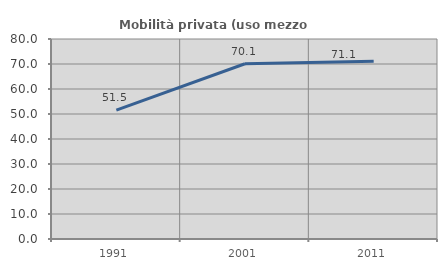
| Category | Mobilità privata (uso mezzo privato) |
|---|---|
| 1991.0 | 51.525 |
| 2001.0 | 70.096 |
| 2011.0 | 71.127 |